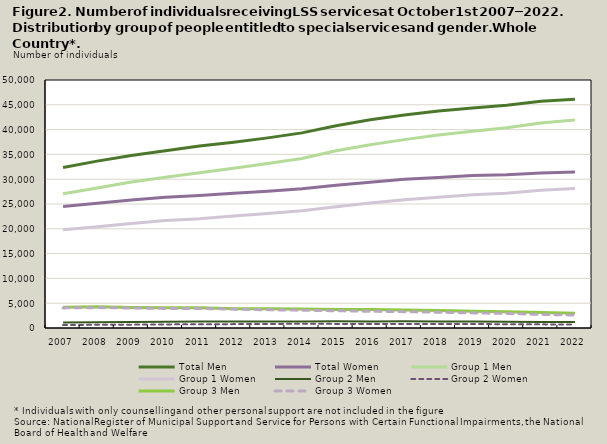
| Category | Total | Group 1 | Group 2 | Group 3 |
|---|---|---|---|---|
| 2007.0 | 24476 | 19820 | 603 | 4053 |
| 2008.0 | 25172 | 20414 | 640 | 4118 |
| 2009.0 | 25799 | 21087 | 676 | 4036 |
| 2010.0 | 26344 | 21671 | 725 | 3948 |
| 2011.0 | 26712 | 22023 | 747 | 3942 |
| 2012.0 | 27189 | 22599 | 782 | 3808 |
| 2013.0 | 27550 | 23072 | 814 | 3664 |
| 2014.0 | 28055 | 23618 | 847 | 3590 |
| 2015.0 | 28768 | 24461 | 831 | 3476 |
| 2016.0 | 29386 | 25183 | 830 | 3373 |
| 2017.0 | 29967 | 25846 | 825 | 3296 |
| 2018.0 | 30343 | 26368 | 802 | 3173 |
| 2019.0 | 30739 | 26887 | 802 | 3050 |
| 2020.0 | 30883 | 27186 | 761 | 2936 |
| 2021.0 | 31254 | 27772 | 734 | 2748 |
| 2022.0 | 31432 | 28109 | 707 | 2616 |